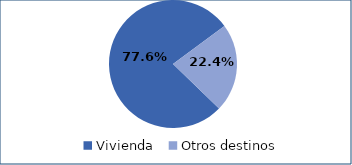
| Category | Series 0 |
|---|---|
| Vivienda | 0.776 |
| Otros destinos | 0.224 |